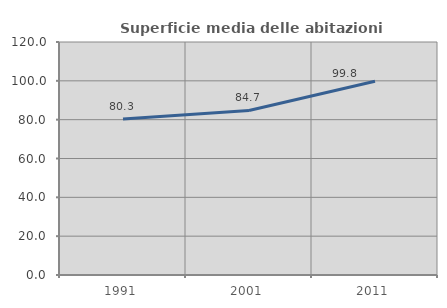
| Category | Superficie media delle abitazioni occupate |
|---|---|
| 1991.0 | 80.345 |
| 2001.0 | 84.73 |
| 2011.0 | 99.78 |